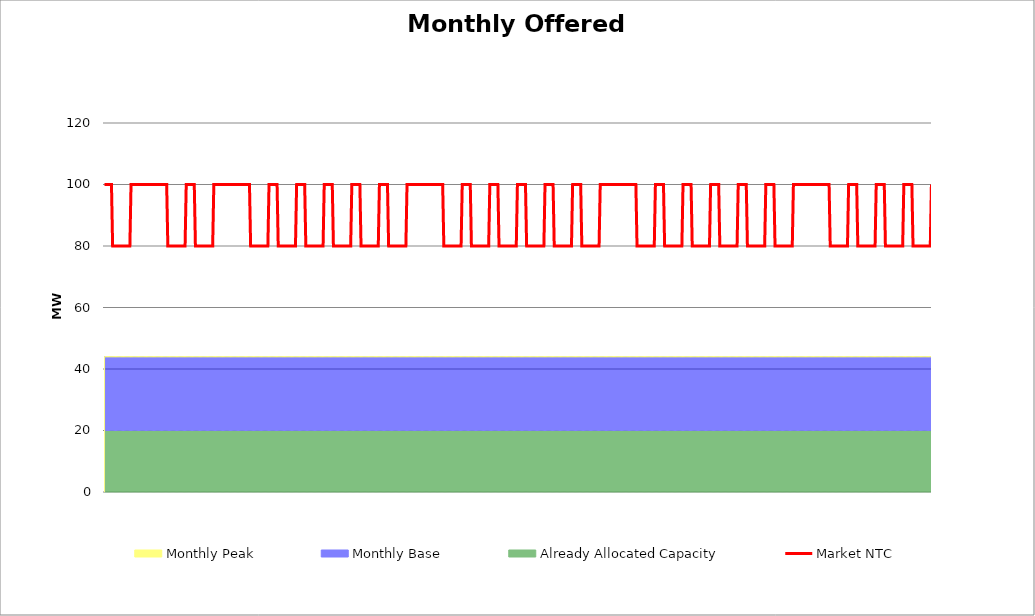
| Category | Market NTC |
|---|---|
| 0 | 100 |
| 1 | 100 |
| 2 | 100 |
| 3 | 100 |
| 4 | 100 |
| 5 | 100 |
| 6 | 100 |
| 7 | 80 |
| 8 | 80 |
| 9 | 80 |
| 10 | 80 |
| 11 | 80 |
| 12 | 80 |
| 13 | 80 |
| 14 | 80 |
| 15 | 80 |
| 16 | 80 |
| 17 | 80 |
| 18 | 80 |
| 19 | 80 |
| 20 | 80 |
| 21 | 80 |
| 22 | 80 |
| 23 | 100 |
| 24 | 100 |
| 25 | 100 |
| 26 | 100 |
| 27 | 100 |
| 28 | 100 |
| 29 | 100 |
| 30 | 100 |
| 31 | 100 |
| 32 | 100 |
| 33 | 100 |
| 34 | 100 |
| 35 | 100 |
| 36 | 100 |
| 37 | 100 |
| 38 | 100 |
| 39 | 100 |
| 40 | 100 |
| 41 | 100 |
| 42 | 100 |
| 43 | 100 |
| 44 | 100 |
| 45 | 100 |
| 46 | 100 |
| 47 | 100 |
| 48 | 100 |
| 49 | 100 |
| 50 | 100 |
| 51 | 100 |
| 52 | 100 |
| 53 | 100 |
| 54 | 100 |
| 55 | 80 |
| 56 | 80 |
| 57 | 80 |
| 58 | 80 |
| 59 | 80 |
| 60 | 80 |
| 61 | 80 |
| 62 | 80 |
| 63 | 80 |
| 64 | 80 |
| 65 | 80 |
| 66 | 80 |
| 67 | 80 |
| 68 | 80 |
| 69 | 80 |
| 70 | 80 |
| 71 | 100 |
| 72 | 100 |
| 73 | 100 |
| 74 | 100 |
| 75 | 100 |
| 76 | 100 |
| 77 | 100 |
| 78 | 100 |
| 79 | 80 |
| 80 | 80 |
| 81 | 80 |
| 82 | 80 |
| 83 | 80 |
| 84 | 80 |
| 85 | 80 |
| 86 | 80 |
| 87 | 80 |
| 88 | 80 |
| 89 | 80 |
| 90 | 80 |
| 91 | 80 |
| 92 | 80 |
| 93 | 80 |
| 94 | 80 |
| 95 | 100 |
| 96 | 100 |
| 97 | 100 |
| 98 | 100 |
| 99 | 100 |
| 100 | 100 |
| 101 | 100 |
| 102 | 100 |
| 103 | 100 |
| 104 | 100 |
| 105 | 100 |
| 106 | 100 |
| 107 | 100 |
| 108 | 100 |
| 109 | 100 |
| 110 | 100 |
| 111 | 100 |
| 112 | 100 |
| 113 | 100 |
| 114 | 100 |
| 115 | 100 |
| 116 | 100 |
| 117 | 100 |
| 118 | 100 |
| 119 | 100 |
| 120 | 100 |
| 121 | 100 |
| 122 | 100 |
| 123 | 100 |
| 124 | 100 |
| 125 | 100 |
| 126 | 100 |
| 127 | 80 |
| 128 | 80 |
| 129 | 80 |
| 130 | 80 |
| 131 | 80 |
| 132 | 80 |
| 133 | 80 |
| 134 | 80 |
| 135 | 80 |
| 136 | 80 |
| 137 | 80 |
| 138 | 80 |
| 139 | 80 |
| 140 | 80 |
| 141 | 80 |
| 142 | 80 |
| 143 | 100 |
| 144 | 100 |
| 145 | 100 |
| 146 | 100 |
| 147 | 100 |
| 148 | 100 |
| 149 | 100 |
| 150 | 100 |
| 151 | 80 |
| 152 | 80 |
| 153 | 80 |
| 154 | 80 |
| 155 | 80 |
| 156 | 80 |
| 157 | 80 |
| 158 | 80 |
| 159 | 80 |
| 160 | 80 |
| 161 | 80 |
| 162 | 80 |
| 163 | 80 |
| 164 | 80 |
| 165 | 80 |
| 166 | 80 |
| 167 | 100 |
| 168 | 100 |
| 169 | 100 |
| 170 | 100 |
| 171 | 100 |
| 172 | 100 |
| 173 | 100 |
| 174 | 100 |
| 175 | 80 |
| 176 | 80 |
| 177 | 80 |
| 178 | 80 |
| 179 | 80 |
| 180 | 80 |
| 181 | 80 |
| 182 | 80 |
| 183 | 80 |
| 184 | 80 |
| 185 | 80 |
| 186 | 80 |
| 187 | 80 |
| 188 | 80 |
| 189 | 80 |
| 190 | 80 |
| 191 | 100 |
| 192 | 100 |
| 193 | 100 |
| 194 | 100 |
| 195 | 100 |
| 196 | 100 |
| 197 | 100 |
| 198 | 100 |
| 199 | 80 |
| 200 | 80 |
| 201 | 80 |
| 202 | 80 |
| 203 | 80 |
| 204 | 80 |
| 205 | 80 |
| 206 | 80 |
| 207 | 80 |
| 208 | 80 |
| 209 | 80 |
| 210 | 80 |
| 211 | 80 |
| 212 | 80 |
| 213 | 80 |
| 214 | 80 |
| 215 | 100 |
| 216 | 100 |
| 217 | 100 |
| 218 | 100 |
| 219 | 100 |
| 220 | 100 |
| 221 | 100 |
| 222 | 100 |
| 223 | 80 |
| 224 | 80 |
| 225 | 80 |
| 226 | 80 |
| 227 | 80 |
| 228 | 80 |
| 229 | 80 |
| 230 | 80 |
| 231 | 80 |
| 232 | 80 |
| 233 | 80 |
| 234 | 80 |
| 235 | 80 |
| 236 | 80 |
| 237 | 80 |
| 238 | 80 |
| 239 | 100 |
| 240 | 100 |
| 241 | 100 |
| 242 | 100 |
| 243 | 100 |
| 244 | 100 |
| 245 | 100 |
| 246 | 100 |
| 247 | 80 |
| 248 | 80 |
| 249 | 80 |
| 250 | 80 |
| 251 | 80 |
| 252 | 80 |
| 253 | 80 |
| 254 | 80 |
| 255 | 80 |
| 256 | 80 |
| 257 | 80 |
| 258 | 80 |
| 259 | 80 |
| 260 | 80 |
| 261 | 80 |
| 262 | 80 |
| 263 | 100 |
| 264 | 100 |
| 265 | 100 |
| 266 | 100 |
| 267 | 100 |
| 268 | 100 |
| 269 | 100 |
| 270 | 100 |
| 271 | 100 |
| 272 | 100 |
| 273 | 100 |
| 274 | 100 |
| 275 | 100 |
| 276 | 100 |
| 277 | 100 |
| 278 | 100 |
| 279 | 100 |
| 280 | 100 |
| 281 | 100 |
| 282 | 100 |
| 283 | 100 |
| 284 | 100 |
| 285 | 100 |
| 286 | 100 |
| 287 | 100 |
| 288 | 100 |
| 289 | 100 |
| 290 | 100 |
| 291 | 100 |
| 292 | 100 |
| 293 | 100 |
| 294 | 100 |
| 295 | 80 |
| 296 | 80 |
| 297 | 80 |
| 298 | 80 |
| 299 | 80 |
| 300 | 80 |
| 301 | 80 |
| 302 | 80 |
| 303 | 80 |
| 304 | 80 |
| 305 | 80 |
| 306 | 80 |
| 307 | 80 |
| 308 | 80 |
| 309 | 80 |
| 310 | 80 |
| 311 | 100 |
| 312 | 100 |
| 313 | 100 |
| 314 | 100 |
| 315 | 100 |
| 316 | 100 |
| 317 | 100 |
| 318 | 100 |
| 319 | 80 |
| 320 | 80 |
| 321 | 80 |
| 322 | 80 |
| 323 | 80 |
| 324 | 80 |
| 325 | 80 |
| 326 | 80 |
| 327 | 80 |
| 328 | 80 |
| 329 | 80 |
| 330 | 80 |
| 331 | 80 |
| 332 | 80 |
| 333 | 80 |
| 334 | 80 |
| 335 | 100 |
| 336 | 100 |
| 337 | 100 |
| 338 | 100 |
| 339 | 100 |
| 340 | 100 |
| 341 | 100 |
| 342 | 100 |
| 343 | 80 |
| 344 | 80 |
| 345 | 80 |
| 346 | 80 |
| 347 | 80 |
| 348 | 80 |
| 349 | 80 |
| 350 | 80 |
| 351 | 80 |
| 352 | 80 |
| 353 | 80 |
| 354 | 80 |
| 355 | 80 |
| 356 | 80 |
| 357 | 80 |
| 358 | 80 |
| 359 | 100 |
| 360 | 100 |
| 361 | 100 |
| 362 | 100 |
| 363 | 100 |
| 364 | 100 |
| 365 | 100 |
| 366 | 100 |
| 367 | 80 |
| 368 | 80 |
| 369 | 80 |
| 370 | 80 |
| 371 | 80 |
| 372 | 80 |
| 373 | 80 |
| 374 | 80 |
| 375 | 80 |
| 376 | 80 |
| 377 | 80 |
| 378 | 80 |
| 379 | 80 |
| 380 | 80 |
| 381 | 80 |
| 382 | 80 |
| 383 | 100 |
| 384 | 100 |
| 385 | 100 |
| 386 | 100 |
| 387 | 100 |
| 388 | 100 |
| 389 | 100 |
| 390 | 100 |
| 391 | 80 |
| 392 | 80 |
| 393 | 80 |
| 394 | 80 |
| 395 | 80 |
| 396 | 80 |
| 397 | 80 |
| 398 | 80 |
| 399 | 80 |
| 400 | 80 |
| 401 | 80 |
| 402 | 80 |
| 403 | 80 |
| 404 | 80 |
| 405 | 80 |
| 406 | 80 |
| 407 | 100 |
| 408 | 100 |
| 409 | 100 |
| 410 | 100 |
| 411 | 100 |
| 412 | 100 |
| 413 | 100 |
| 414 | 100 |
| 415 | 80 |
| 416 | 80 |
| 417 | 80 |
| 418 | 80 |
| 419 | 80 |
| 420 | 80 |
| 421 | 80 |
| 422 | 80 |
| 423 | 80 |
| 424 | 80 |
| 425 | 80 |
| 426 | 80 |
| 427 | 80 |
| 428 | 80 |
| 429 | 80 |
| 430 | 80 |
| 431 | 100 |
| 432 | 100 |
| 433 | 100 |
| 434 | 100 |
| 435 | 100 |
| 436 | 100 |
| 437 | 100 |
| 438 | 100 |
| 439 | 100 |
| 440 | 100 |
| 441 | 100 |
| 442 | 100 |
| 443 | 100 |
| 444 | 100 |
| 445 | 100 |
| 446 | 100 |
| 447 | 100 |
| 448 | 100 |
| 449 | 100 |
| 450 | 100 |
| 451 | 100 |
| 452 | 100 |
| 453 | 100 |
| 454 | 100 |
| 455 | 100 |
| 456 | 100 |
| 457 | 100 |
| 458 | 100 |
| 459 | 100 |
| 460 | 100 |
| 461 | 100 |
| 462 | 100 |
| 463 | 80 |
| 464 | 80 |
| 465 | 80 |
| 466 | 80 |
| 467 | 80 |
| 468 | 80 |
| 469 | 80 |
| 470 | 80 |
| 471 | 80 |
| 472 | 80 |
| 473 | 80 |
| 474 | 80 |
| 475 | 80 |
| 476 | 80 |
| 477 | 80 |
| 478 | 80 |
| 479 | 100 |
| 480 | 100 |
| 481 | 100 |
| 482 | 100 |
| 483 | 100 |
| 484 | 100 |
| 485 | 100 |
| 486 | 100 |
| 487 | 80 |
| 488 | 80 |
| 489 | 80 |
| 490 | 80 |
| 491 | 80 |
| 492 | 80 |
| 493 | 80 |
| 494 | 80 |
| 495 | 80 |
| 496 | 80 |
| 497 | 80 |
| 498 | 80 |
| 499 | 80 |
| 500 | 80 |
| 501 | 80 |
| 502 | 80 |
| 503 | 100 |
| 504 | 100 |
| 505 | 100 |
| 506 | 100 |
| 507 | 100 |
| 508 | 100 |
| 509 | 100 |
| 510 | 100 |
| 511 | 80 |
| 512 | 80 |
| 513 | 80 |
| 514 | 80 |
| 515 | 80 |
| 516 | 80 |
| 517 | 80 |
| 518 | 80 |
| 519 | 80 |
| 520 | 80 |
| 521 | 80 |
| 522 | 80 |
| 523 | 80 |
| 524 | 80 |
| 525 | 80 |
| 526 | 80 |
| 527 | 100 |
| 528 | 100 |
| 529 | 100 |
| 530 | 100 |
| 531 | 100 |
| 532 | 100 |
| 533 | 100 |
| 534 | 100 |
| 535 | 80 |
| 536 | 80 |
| 537 | 80 |
| 538 | 80 |
| 539 | 80 |
| 540 | 80 |
| 541 | 80 |
| 542 | 80 |
| 543 | 80 |
| 544 | 80 |
| 545 | 80 |
| 546 | 80 |
| 547 | 80 |
| 548 | 80 |
| 549 | 80 |
| 550 | 80 |
| 551 | 100 |
| 552 | 100 |
| 553 | 100 |
| 554 | 100 |
| 555 | 100 |
| 556 | 100 |
| 557 | 100 |
| 558 | 100 |
| 559 | 80 |
| 560 | 80 |
| 561 | 80 |
| 562 | 80 |
| 563 | 80 |
| 564 | 80 |
| 565 | 80 |
| 566 | 80 |
| 567 | 80 |
| 568 | 80 |
| 569 | 80 |
| 570 | 80 |
| 571 | 80 |
| 572 | 80 |
| 573 | 80 |
| 574 | 80 |
| 575 | 100 |
| 576 | 100 |
| 577 | 100 |
| 578 | 100 |
| 579 | 100 |
| 580 | 100 |
| 581 | 100 |
| 582 | 100 |
| 583 | 80 |
| 584 | 80 |
| 585 | 80 |
| 586 | 80 |
| 587 | 80 |
| 588 | 80 |
| 589 | 80 |
| 590 | 80 |
| 591 | 80 |
| 592 | 80 |
| 593 | 80 |
| 594 | 80 |
| 595 | 80 |
| 596 | 80 |
| 597 | 80 |
| 598 | 80 |
| 599 | 100 |
| 600 | 100 |
| 601 | 100 |
| 602 | 100 |
| 603 | 100 |
| 604 | 100 |
| 605 | 100 |
| 606 | 100 |
| 607 | 100 |
| 608 | 100 |
| 609 | 100 |
| 610 | 100 |
| 611 | 100 |
| 612 | 100 |
| 613 | 100 |
| 614 | 100 |
| 615 | 100 |
| 616 | 100 |
| 617 | 100 |
| 618 | 100 |
| 619 | 100 |
| 620 | 100 |
| 621 | 100 |
| 622 | 100 |
| 623 | 100 |
| 624 | 100 |
| 625 | 100 |
| 626 | 100 |
| 627 | 100 |
| 628 | 100 |
| 629 | 100 |
| 630 | 100 |
| 631 | 80 |
| 632 | 80 |
| 633 | 80 |
| 634 | 80 |
| 635 | 80 |
| 636 | 80 |
| 637 | 80 |
| 638 | 80 |
| 639 | 80 |
| 640 | 80 |
| 641 | 80 |
| 642 | 80 |
| 643 | 80 |
| 644 | 80 |
| 645 | 80 |
| 646 | 80 |
| 647 | 100 |
| 648 | 100 |
| 649 | 100 |
| 650 | 100 |
| 651 | 100 |
| 652 | 100 |
| 653 | 100 |
| 654 | 100 |
| 655 | 80 |
| 656 | 80 |
| 657 | 80 |
| 658 | 80 |
| 659 | 80 |
| 660 | 80 |
| 661 | 80 |
| 662 | 80 |
| 663 | 80 |
| 664 | 80 |
| 665 | 80 |
| 666 | 80 |
| 667 | 80 |
| 668 | 80 |
| 669 | 80 |
| 670 | 80 |
| 671 | 100 |
| 672 | 100 |
| 673 | 100 |
| 674 | 100 |
| 675 | 100 |
| 676 | 100 |
| 677 | 100 |
| 678 | 100 |
| 679 | 80 |
| 680 | 80 |
| 681 | 80 |
| 682 | 80 |
| 683 | 80 |
| 684 | 80 |
| 685 | 80 |
| 686 | 80 |
| 687 | 80 |
| 688 | 80 |
| 689 | 80 |
| 690 | 80 |
| 691 | 80 |
| 692 | 80 |
| 693 | 80 |
| 694 | 80 |
| 695 | 100 |
| 696 | 100 |
| 697 | 100 |
| 698 | 100 |
| 699 | 100 |
| 700 | 100 |
| 701 | 100 |
| 702 | 100 |
| 703 | 80 |
| 704 | 80 |
| 705 | 80 |
| 706 | 80 |
| 707 | 80 |
| 708 | 80 |
| 709 | 80 |
| 710 | 80 |
| 711 | 80 |
| 712 | 80 |
| 713 | 80 |
| 714 | 80 |
| 715 | 80 |
| 716 | 80 |
| 717 | 80 |
| 718 | 80 |
| 719 | 100 |